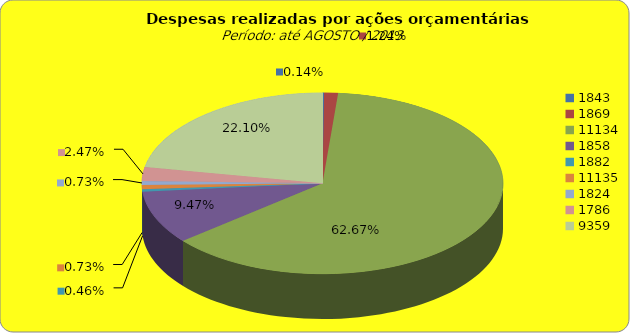
| Category | Series 1 |
|---|---|
| 1843.0 | 158823.87 |
| 1869.0 | 1366628.6 |
| 11134.0 | 69329316.88 |
| 1858.0 | 10471498.27 |
| 1882.0 | 503655.42 |
| 11135.0 | 809710.36 |
| 1824.0 | 806188.23 |
| 1786.0 | 2736868.74 |
| 9359.0 | 24451124.73 |